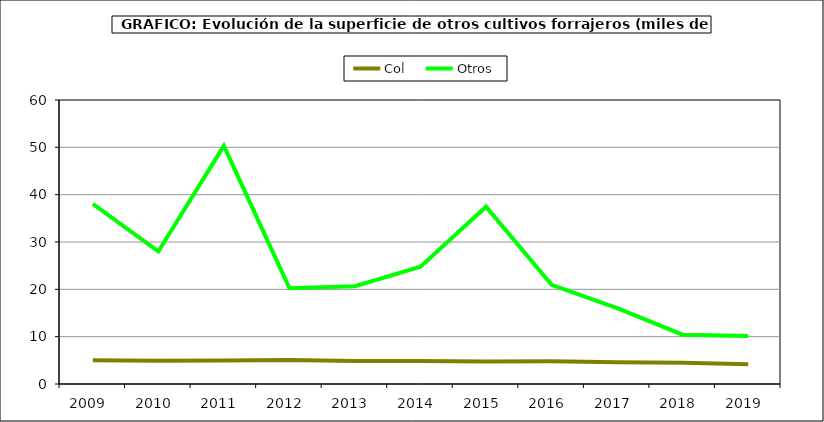
| Category | Col | Otros |
|---|---|---|
| 2009.0 | 4.996 | 38.075 |
| 2010.0 | 4.899 | 27.997 |
| 2011.0 | 4.982 | 50.317 |
| 2012.0 | 5.09 | 20.245 |
| 2013.0 | 4.865 | 20.659 |
| 2014.0 | 4.875 | 24.797 |
| 2015.0 | 4.771 | 37.464 |
| 2016.0 | 4.781 | 20.965 |
| 2017.0 | 4.601 | 16.007 |
| 2018.0 | 4.492 | 10.42 |
| 2019.0 | 4.151 | 10.158 |